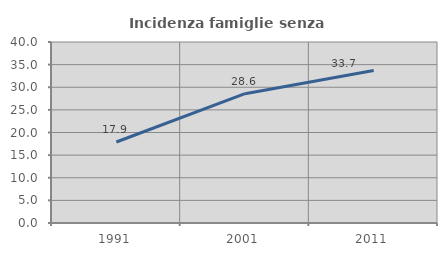
| Category | Incidenza famiglie senza nuclei |
|---|---|
| 1991.0 | 17.898 |
| 2001.0 | 28.571 |
| 2011.0 | 33.682 |